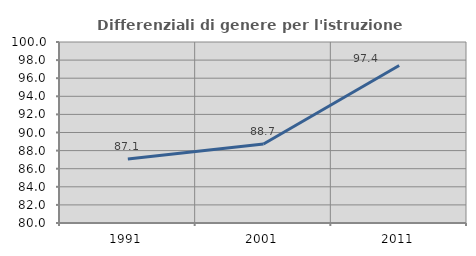
| Category | Differenziali di genere per l'istruzione superiore |
|---|---|
| 1991.0 | 87.081 |
| 2001.0 | 88.733 |
| 2011.0 | 97.398 |